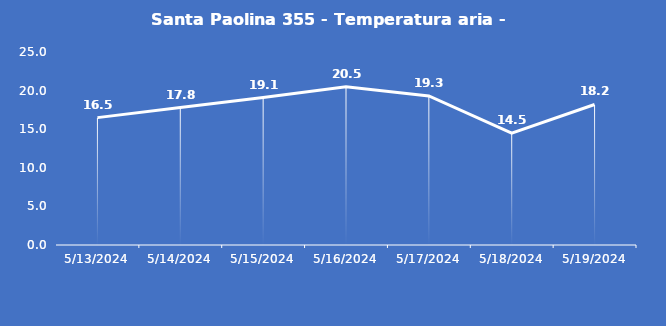
| Category | Santa Paolina 355 - Temperatura aria - Grezzo (°C) |
|---|---|
| 5/13/24 | 16.5 |
| 5/14/24 | 17.8 |
| 5/15/24 | 19.1 |
| 5/16/24 | 20.5 |
| 5/17/24 | 19.3 |
| 5/18/24 | 14.5 |
| 5/19/24 | 18.2 |